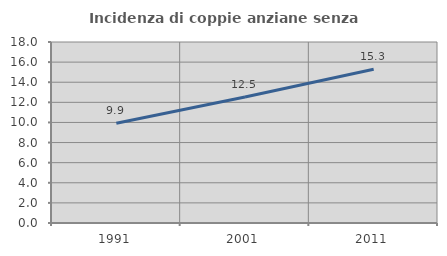
| Category | Incidenza di coppie anziane senza figli  |
|---|---|
| 1991.0 | 9.912 |
| 2001.0 | 12.524 |
| 2011.0 | 15.294 |